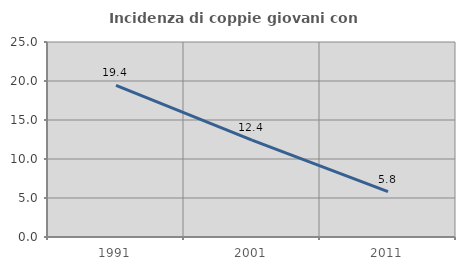
| Category | Incidenza di coppie giovani con figli |
|---|---|
| 1991.0 | 19.439 |
| 2001.0 | 12.421 |
| 2011.0 | 5.814 |